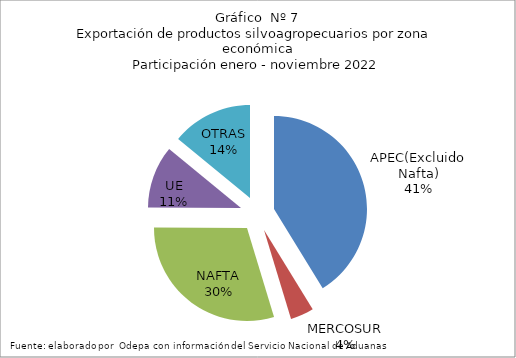
| Category | Series 0 |
|---|---|
| APEC(Excluido Nafta) | 6986593.8 |
| MERCOSUR | 690532.2 |
| NAFTA | 5048922.088 |
| UE | 1838119.917 |
| OTRAS | 2381570.995 |